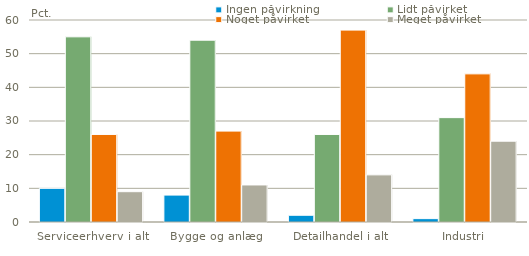
| Category | Ingen påvirkning | Lidt påvirket | Noget påvirket | Meget påvirket |
|---|---|---|---|---|
| Serviceerhverv i alt | 10 | 55 | 26 | 9 |
| Bygge og anlæg | 8 | 54 | 27 | 11 |
| Detailhandel i alt | 2 | 26 | 57 | 14 |
| Industri | 1 | 31 | 44 | 24 |